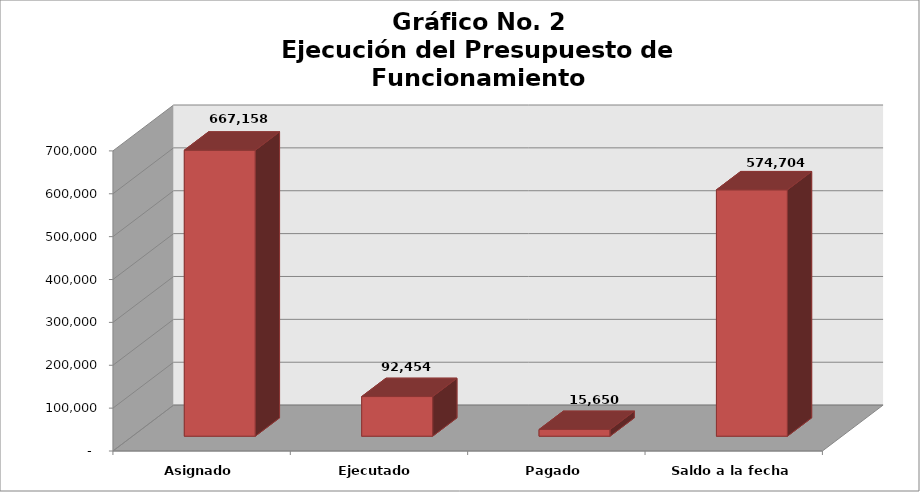
| Category | Series 0 |
|---|---|
| Asignado | 667158 |
| Ejecutado | 92454 |
| Pagado | 15650 |
| Saldo a la fecha | 574704 |